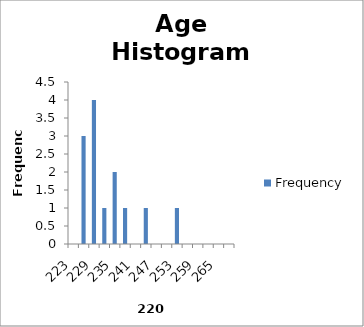
| Category | Frequency |
|---|---|
| 223 | 0 |
| 226 | 3 |
| 229 | 4 |
| 232 | 1 |
| 235 | 2 |
| 238 | 1 |
| 241 | 0 |
| 244 | 1 |
| 247 | 0 |
| 250 | 0 |
| 253 | 1 |
| 256 | 0 |
| 259 | 0 |
| 262 | 0 |
| 265 | 0 |
| More | 0 |